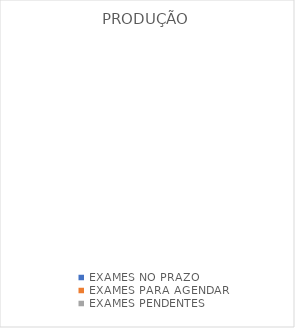
| Category | PRODUÇÃO |
|---|---|
| EXAMES NO PRAZO | 0 |
| EXAMES PARA AGENDAR | 0 |
| EXAMES PENDENTES | 0 |